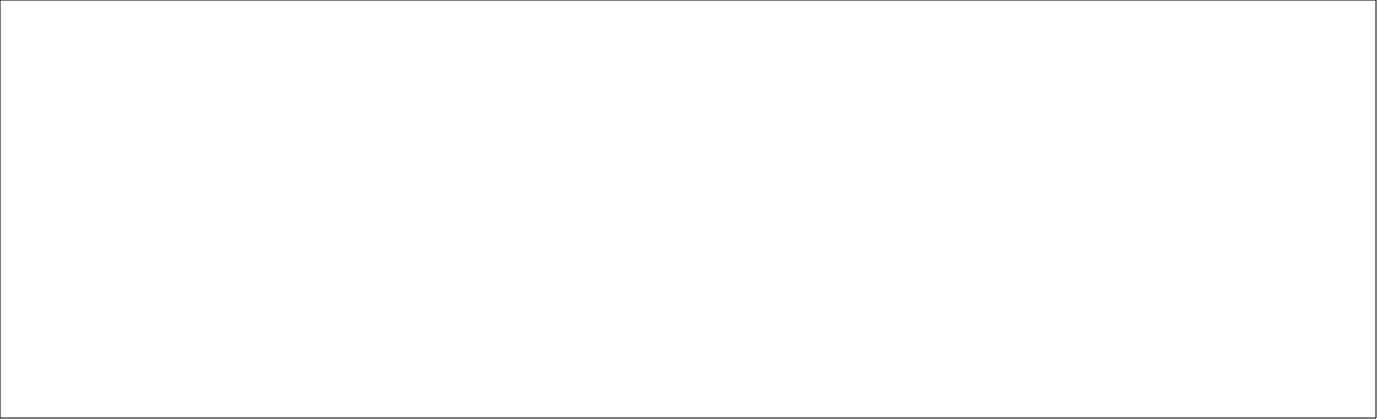
| Category | Sum of Mean |
|---|---|
| Adequate Experience | 80.23 |
| Clinical Supervision | 90.85 |
| Clinical Supervision out of hours | 81.5 |
| Curriculum Coverage | 71.59 |
| Educational Governance | 74.24 |
| Educational Supervision | 83.81 |
| Feedback | 81.67 |
| Handover | 56.98 |
| Induction | 74.09 |
| Local Teaching | 79.44 |
| Overall Satisfaction | 78.05 |
| Regional Teaching | 60.59 |
| Reporting systems | 73.16 |
| Rota Design | 59.17 |
| Study Leave | 54.17 |
| Supportive environment | 78.41 |
| Teamwork | 74.24 |
| Work Load | 61.46 |